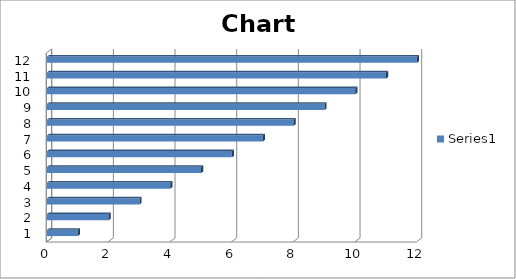
| Category | Series 0 |
|---|---|
| 0 | 1 |
| 1 | 2 |
| 2 | 3 |
| 3 | 4 |
| 4 | 5 |
| 5 | 6 |
| 6 | 7 |
| 7 | 8 |
| 8 | 9 |
| 9 | 10 |
| 10 | 11 |
| 11 | 12 |